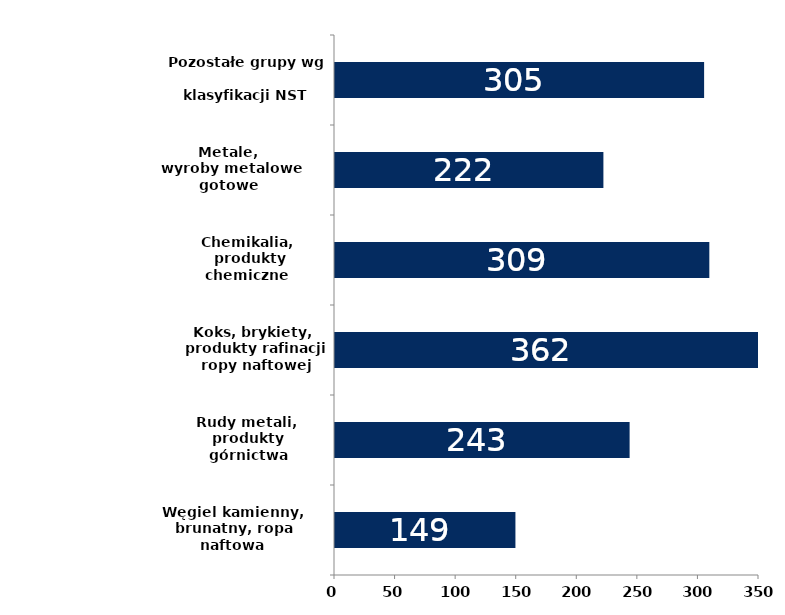
| Category | III kwartał |
|---|---|
| Węgiel kamienny,
 brunatny, ropa naftowa
 i gaz ziemny | 148.937 |
| Rudy metali, 
produkty górnictwa
 i kopalnictwa | 243.192 |
| Koks, brykiety,
 produkty rafinacji
 ropy naftowej | 361.713 |
| Chemikalia,
 produkty chemiczne | 308.997 |
| Metale,
 wyroby metalowe gotowe | 221.556 |
| Pozostałe grupy wg 
klasyfikacji NST | 304.692 |